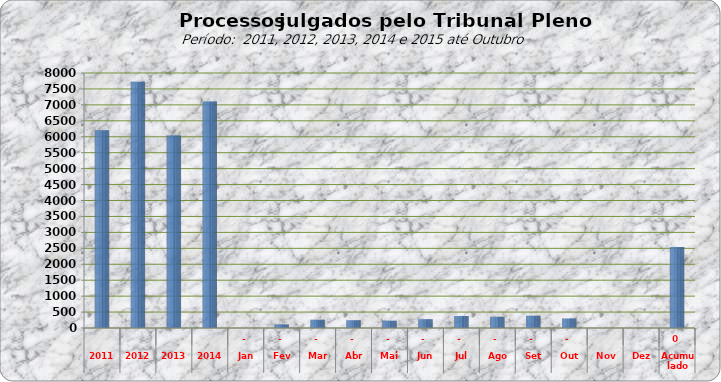
| Category | 6205 7722 6043  7.108  0 113 258 243 231 277 379 354 384 301 0 0 |
|---|---|
| 2011 | 6205 |
| 2012 | 7722 |
| 2013 | 6043 |
| 2014 | 7108 |
| Jan | 0 |
| Fev | 113 |
| Mar | 258 |
| Abr | 243 |
| Mai | 231 |
| Jun | 277 |
| Jul | 379 |
| Ago | 354 |
| Set | 384 |
| Out | 301 |
| Nov | 0 |
| Dez | 0 |
| Acumulado | 2540 |